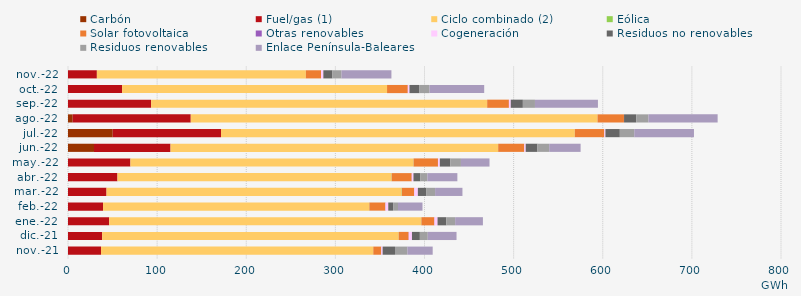
| Category | Carbón | Fuel/gas (1) | Ciclo combinado (2) | Eólica | Solar fotovoltaica | Otras renovables | Cogeneración | Residuos no renovables | Residuos renovables | Enlace Península-Baleares |
|---|---|---|---|---|---|---|---|---|---|---|
| nov.-21 | -0.582 | 37.047 | 305.438 | 0.061 | 8.818 | 0.24 | 1.412 | 13.868 | 13.868 | 28.436 |
| dic.-21 | -0.614 | 38.335 | 332.591 | 0.101 | 11.153 | 0.23 | 3.519 | 8.866 | 8.866 | 32.271 |
| ene.-22 | -0.627 | 46.217 | 350.087 | 0.216 | 14.437 | 0.285 | 3.401 | 9.871 | 9.871 | 31.159 |
| feb.-22 | -0.58 | 39.301 | 298.623 | 0.228 | 17.857 | 0.281 | 3.068 | 5.441 | 5.441 | 27.503 |
| mar.-22 | -0.669 | 43.218 | 331.001 | 0.338 | 13.718 | 0.291 | 3.993 | 9.663 | 9.663 | 30.689 |
| abr.-22 | -0.605 | 55.507 | 307.429 | 0.24 | 22.444 | 0.165 | 1.839 | 7.805 | 7.805 | 33.641 |
| may.-22 | -1.03 | 70.043 | 317.556 | 0.161 | 27.327 | 0.166 | 1.946 | 11.846 | 11.846 | 32.047 |
| jun.-22 | 29.142 | 85.898 | 367.588 | 0.061 | 29.226 | 0.111 | 1.536 | 13.186 | 13.186 | 35.225 |
| jul.-22 | 50.189 | 121.497 | 396.96 | 0.03 | 33.05 | 0.095 | 1.172 | 16.161 | 16.161 | 67.033 |
| ago.-22 | 5.265 | 132.464 | 456.377 | 0.032 | 29.653 | 0.057 | 0.051 | 13.672 | 13.672 | 77.653 |
| sep.-22 | -0.604 | 93.244 | 377.074 | 0.013 | 24.348 | 0.072 | 2.037 | 13.582 | 13.582 | 70.647 |
| oct.-22 | -0.613 | 60.669 | 297.321 | 0.003 | 23.236 | 0.097 | 1.827 | 11.231 | 11.231 | 61.365 |
| nov.-22 | -0.588 | 32.394 | 234.48 | 0.026 | 16.977 | 0.085 | 2.554 | 10.189 | 10.189 | 55.991 |